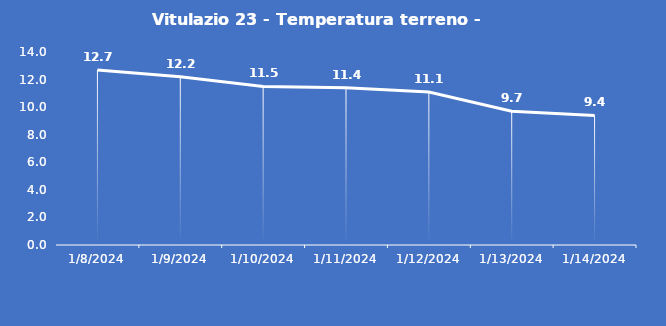
| Category | Vitulazio 23 - Temperatura terreno - Grezzo (°C) |
|---|---|
| 1/8/24 | 12.7 |
| 1/9/24 | 12.2 |
| 1/10/24 | 11.5 |
| 1/11/24 | 11.4 |
| 1/12/24 | 11.1 |
| 1/13/24 | 9.7 |
| 1/14/24 | 9.4 |